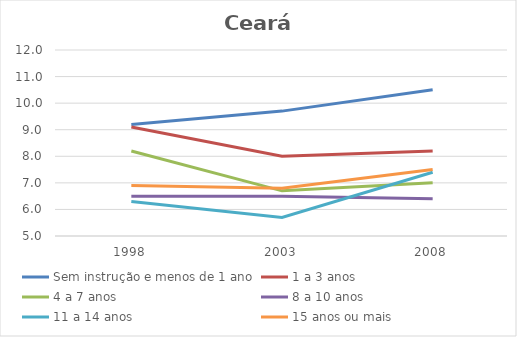
| Category | Sem instrução e menos de 1 ano | 1 a 3 anos | 4 a 7 anos | 8 a 10 anos | 11 a 14 anos | 15 anos ou mais |
|---|---|---|---|---|---|---|
| 1998.0 | 9.2 | 9.1 | 8.2 | 6.5 | 6.3 | 6.9 |
| 2003.0 | 9.7 | 8 | 6.7 | 6.5 | 5.7 | 6.8 |
| 2008.0 | 10.5 | 8.2 | 7 | 6.4 | 7.4 | 7.5 |